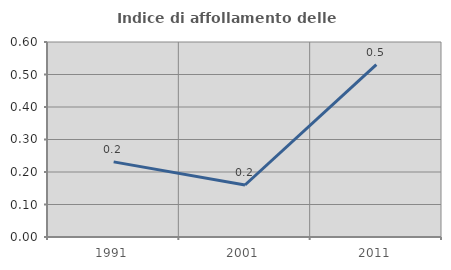
| Category | Indice di affollamento delle abitazioni  |
|---|---|
| 1991.0 | 0.231 |
| 2001.0 | 0.16 |
| 2011.0 | 0.53 |